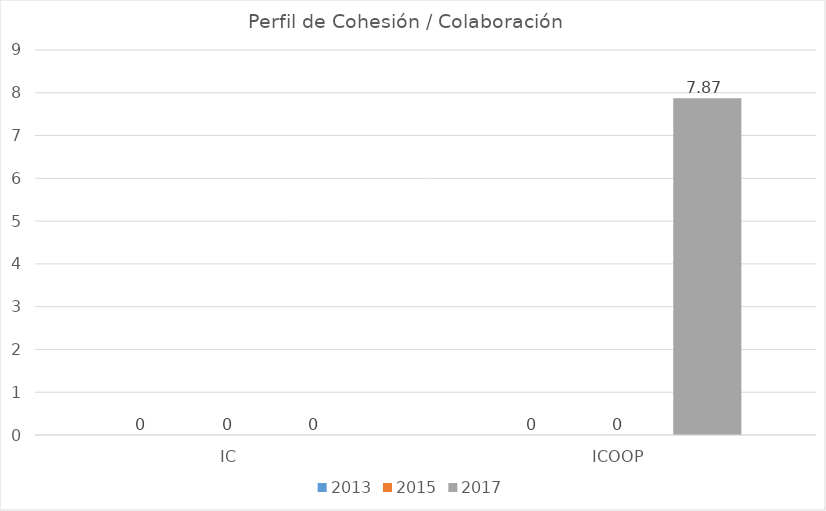
| Category | 2013 | 2015 | 2017 |
|---|---|---|---|
| IC | 0 | 0 | 0 |
| ICOOP | 0 | 0 | 7.87 |